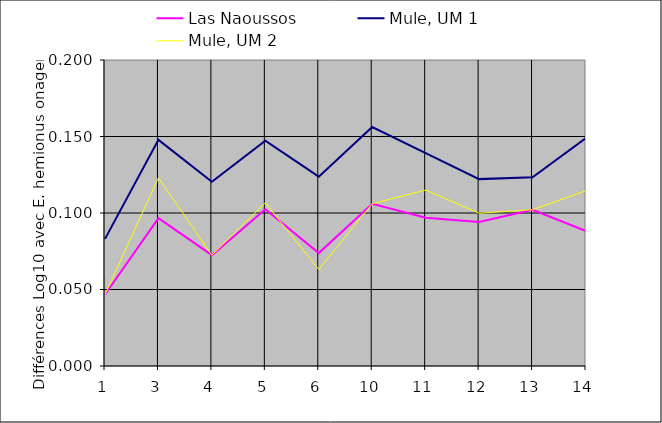
| Category | Las Naoussos | Mule, UM 1 | Mule, UM 2 |
|---|---|---|---|
| 1.0 | 0.047 | 0.083 | 0.047 |
| 3.0 | 0.097 | 0.148 | 0.123 |
| 4.0 | 0.072 | 0.12 | 0.072 |
| 5.0 | 0.102 | 0.147 | 0.107 |
| 6.0 | 0.074 | 0.124 | 0.063 |
| 10.0 | 0.106 | 0.156 | 0.106 |
| 11.0 | 0.097 | 0.139 | 0.115 |
| 12.0 | 0.094 | 0.122 | 0.1 |
| 13.0 | 0.102 | 0.123 | 0.102 |
| 14.0 | 0.088 | 0.149 | 0.115 |